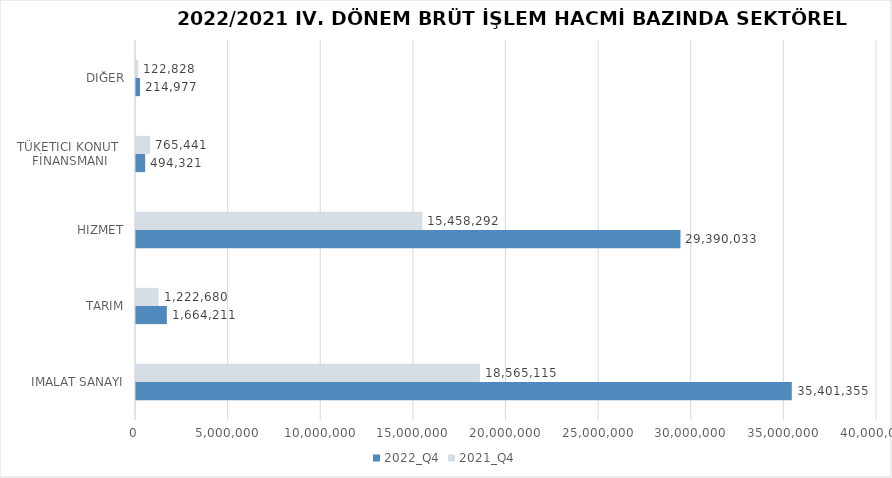
| Category | 2022_Q4 | 2021_Q4 |
|---|---|---|
| İMALAT SANAYİ | 35401354.619 | 18565115 |
| TARIM | 1664211.191 | 1222680 |
| HİZMET | 29390032.677 | 15458292 |
| TÜKETİCİ KONUT 
FİNANSMANI | 494321 | 765441 |
| DİĞER | 214977 | 122828 |